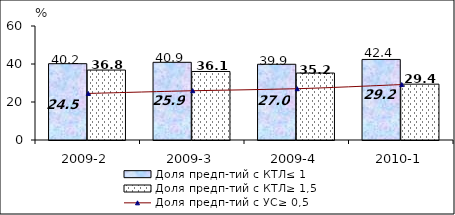
| Category | Доля предп-тий с КТЛ≤ 1 | Доля предп-тий с КТЛ≥ 1,5 |
|---|---|---|
| 2009-2 | 40.159 | 36.816 |
| 2009-3 | 40.892 | 36.064 |
| 2009-4 | 39.855 | 35.243 |
| 2010-1 | 42.395 | 29.39 |